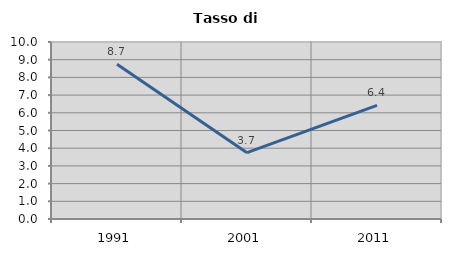
| Category | Tasso di disoccupazione   |
|---|---|
| 1991.0 | 8.743 |
| 2001.0 | 3.745 |
| 2011.0 | 6.424 |